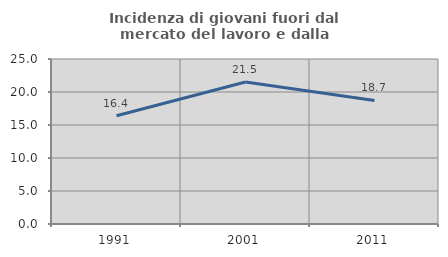
| Category | Incidenza di giovani fuori dal mercato del lavoro e dalla formazione  |
|---|---|
| 1991.0 | 16.409 |
| 2001.0 | 21.508 |
| 2011.0 | 18.713 |